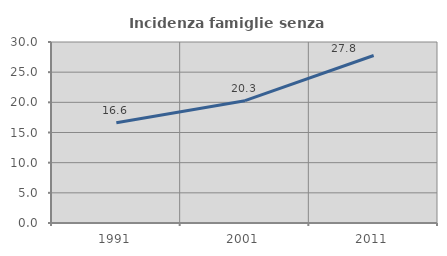
| Category | Incidenza famiglie senza nuclei |
|---|---|
| 1991.0 | 16.608 |
| 2001.0 | 20.276 |
| 2011.0 | 27.768 |